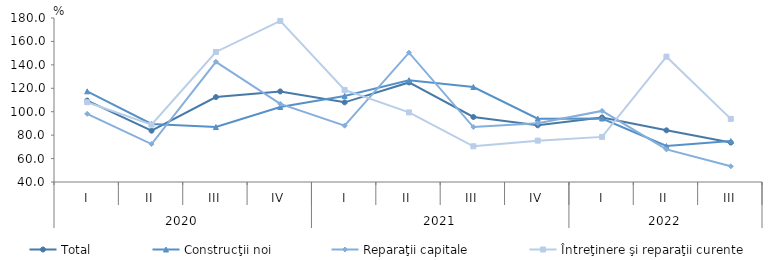
| Category | Total | Construcţii noi | Reparaţii capitale | Întreţinere şi reparaţii curente |
|---|---|---|---|---|
| 0 | 109.5 | 117.4 | 98.2 | 108.1 |
| 1 | 83.8 | 89.5 | 72.4 | 89 |
| 2 | 112.5 | 86.9 | 142.6 | 151 |
| 3 | 117.3 | 104 | 106.7 | 177.5 |
| 4 | 108 | 113.5 | 88.1 | 118.6 |
| 5 | 125 | 126.9 | 150.4 | 99.4 |
| 6 | 95.5 | 121.1 | 86.9 | 70.5 |
| 7 | 88.4 | 94.1 | 90.1 | 75.3 |
| 8 | 95.1 | 94.2 | 100.7 | 78.5 |
| 9 | 84.1 | 70.7 | 67.8 | 147 |
| 10 | 73.7 | 74.9 | 53.4 | 93.9 |